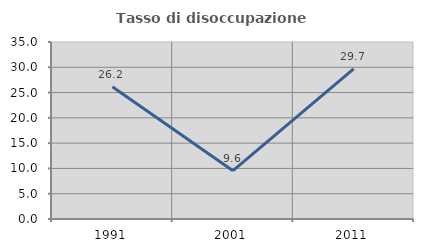
| Category | Tasso di disoccupazione giovanile  |
|---|---|
| 1991.0 | 26.172 |
| 2001.0 | 9.559 |
| 2011.0 | 29.703 |